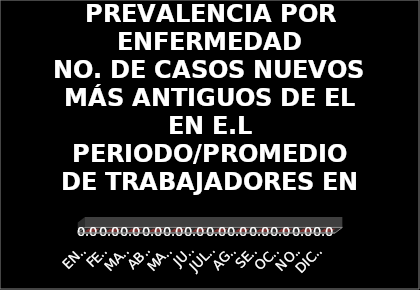
| Category | PREVALENCIA POR ENFERMEDAD
NO. DE CASOS NUEVOS MÁS ANTIGUOS DE EL EN E.L PERIODO/PROMEDIO DE TRABAJADORES EN EL PERIODO*100.000  |
|---|---|
| ENERO | 0 |
| FEBRERO | 0 |
| MARZO | 0 |
| ABRIL | 0 |
| MAYO | 0 |
| JUNIO | 0 |
| JULIO | 0 |
| AGOSTO | 0 |
| SEPTIEMBRE | 0 |
| OCTUBRE | 0 |
| NOVIEMBRE | 0 |
| DICIEMBRE | 0 |